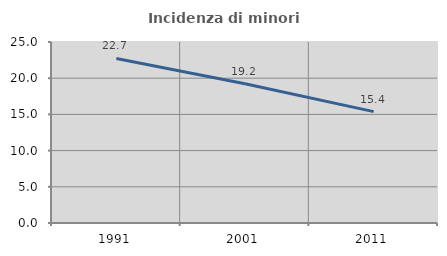
| Category | Incidenza di minori stranieri |
|---|---|
| 1991.0 | 22.727 |
| 2001.0 | 19.231 |
| 2011.0 | 15.385 |